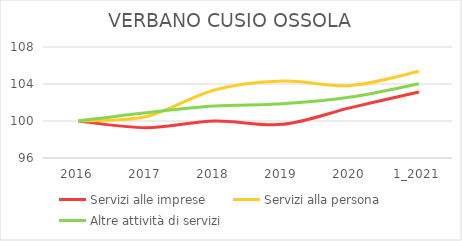
| Category | Servizi alle imprese | Servizi alla persona | Altre attività di servizi |
|---|---|---|---|
| 2016 | 100 | 100 | 100 |
| 2017 | 99.278 | 100.479 | 100.901 |
| 2018 | 100 | 103.356 | 101.623 |
| 2019 | 99.639 | 104.314 | 101.863 |
| 2020 | 101.444 | 103.835 | 102.584 |
| 1_2021 | 103.129 | 105.369 | 104.026 |